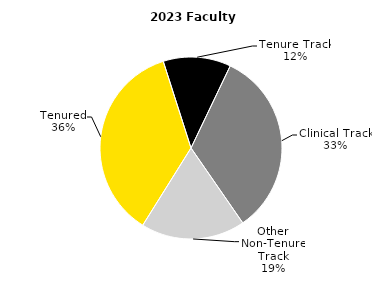
| Category | Series 0 |
|---|---|
| Tenured | 993.535 |
| Tenure Track | 330.199 |
| Clinical Track | 913.966 |
| Other Non-Tenure Track | 508.348 |